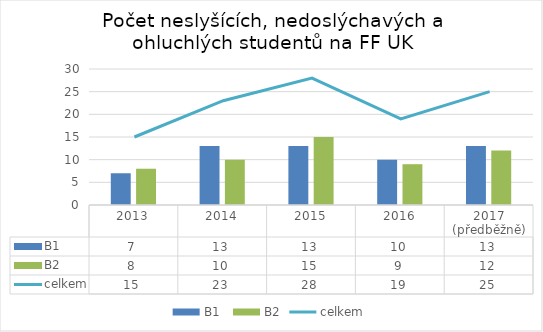
| Category | B1  | B2 |
|---|---|---|
| 2013 | 7 | 8 |
| 2014 | 13 | 10 |
| 2015 | 13 | 15 |
| 2016 | 10 | 9 |
| 2017 (předběžně) | 13 | 12 |